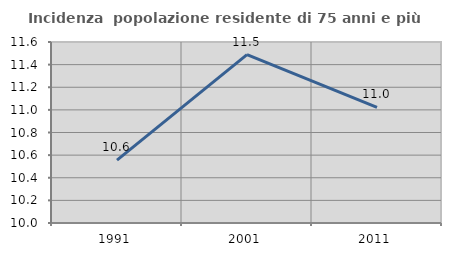
| Category | Incidenza  popolazione residente di 75 anni e più |
|---|---|
| 1991.0 | 10.556 |
| 2001.0 | 11.488 |
| 2011.0 | 11.022 |